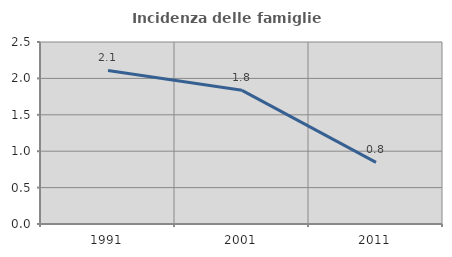
| Category | Incidenza delle famiglie numerose |
|---|---|
| 1991.0 | 2.109 |
| 2001.0 | 1.836 |
| 2011.0 | 0.847 |